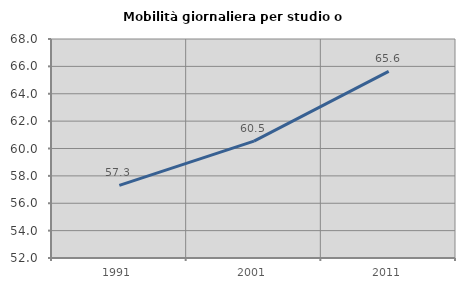
| Category | Mobilità giornaliera per studio o lavoro |
|---|---|
| 1991.0 | 57.311 |
| 2001.0 | 60.534 |
| 2011.0 | 65.631 |